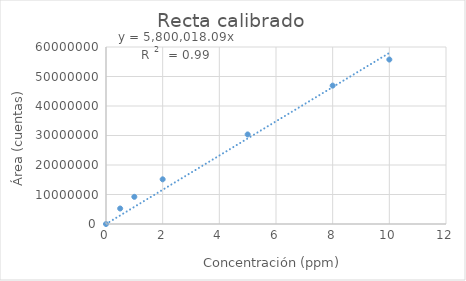
| Category | Recta calibrado |
|---|---|
| 0.0 | 0 |
| 0.5 | 5251727 |
| 1.0 | 9209622 |
| 2.0 | 15146875 |
| 5.0 | 30358971 |
| 8.0 | 46906243 |
| 10.0 | 55747948 |